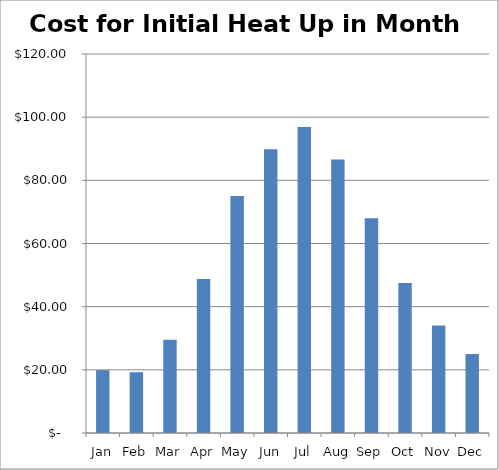
| Category | Cost for Initial Heat Up in Month of Year |
|---|---|
| Jan | 19.887 |
| Feb | 19.246 |
| Mar | 29.51 |
| Apr | 48.756 |
| May | 75.058 |
| Jun | 89.813 |
| Jul | 96.87 |
| Aug | 86.605 |
| Sep | 68.001 |
| Oct | 47.472 |
| Nov | 34.001 |
| Dec | 25.019 |